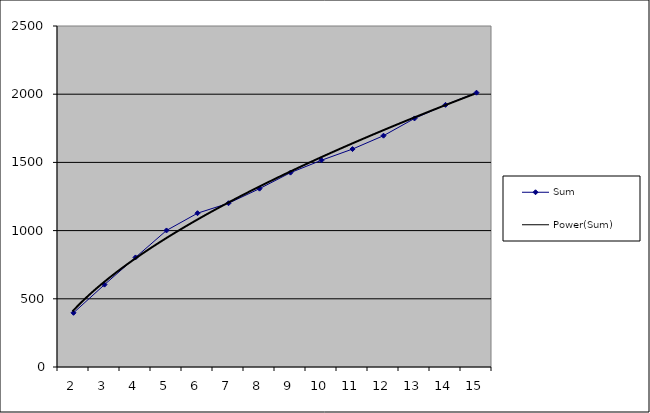
| Category | Sum |
|---|---|
| 2.0 | 397.215 |
| 3.0 | 603.838 |
| 4.0 | 803.336 |
| 5.0 | 1001.053 |
| 6.0 | 1127.521 |
| 7.0 | 1200.551 |
| 8.0 | 1307.425 |
| 9.0 | 1424.987 |
| 10.0 | 1515.83 |
| 11.0 | 1597.767 |
| 12.0 | 1695.734 |
| 13.0 | 1822.202 |
| 14.0 | 1921.951 |
| 15.0 | 2011.013 |